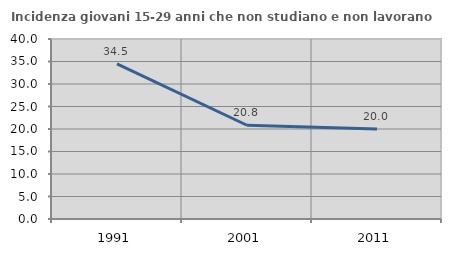
| Category | Incidenza giovani 15-29 anni che non studiano e non lavorano  |
|---|---|
| 1991.0 | 34.483 |
| 2001.0 | 20.833 |
| 2011.0 | 20 |